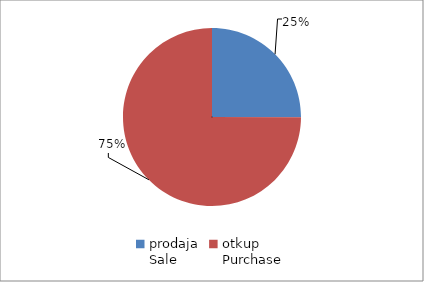
| Category | Series 0 |
|---|---|
| prodaja
Sale | 5696789.1 |
| otkup
Purchase | 17029703.87 |